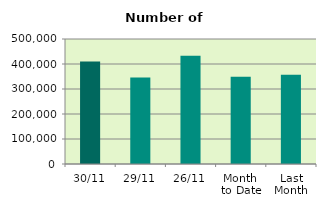
| Category | Series 0 |
|---|---|
| 30/11 | 410374 |
| 29/11 | 346194 |
| 26/11 | 432612 |
| Month 
to Date | 349295 |
| Last
Month | 357160.667 |